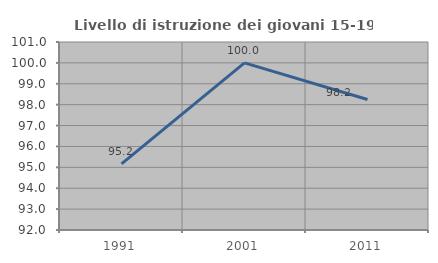
| Category | Livello di istruzione dei giovani 15-19 anni |
|---|---|
| 1991.0 | 95.161 |
| 2001.0 | 100 |
| 2011.0 | 98.246 |